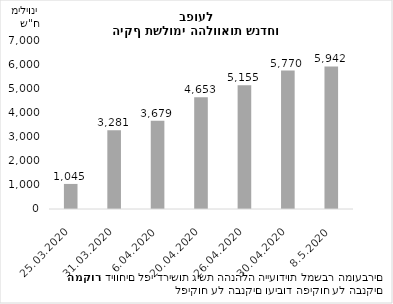
| Category | יתרת התשלומים שנדחו בפועל (מיליוני ₪) |
|---|---|
| 25.03.2020 | 1044.555 |
| 31.03.2020 | 3280.708 |
| 6.04.2020 | 3679.056 |
| 20.04.2020 | 4653.371 |
| 26.04.2020 | 5154.737 |
| 30.04.2020 | 5770 |
| 8.5.2020 | 5942 |